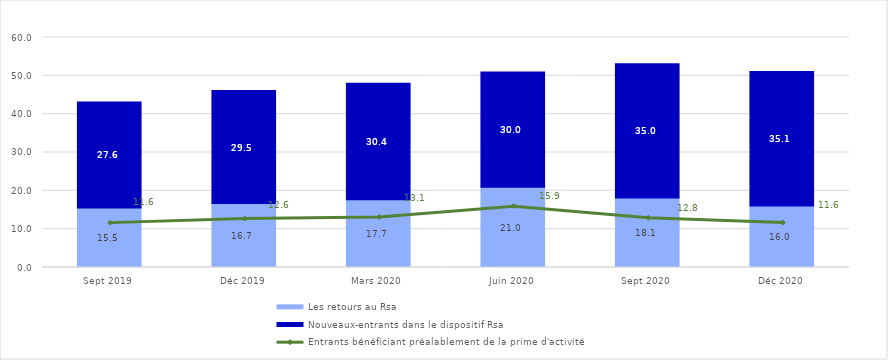
| Category | Les retours au Rsa | Nouveaux-entrants dans le dispositif Rsa  |
|---|---|---|
| Sept 2019 | 15.531 | 27.648 |
| Déc 2019 | 16.682 | 29.504 |
| Mars 2020 | 17.701 | 30.358 |
| Juin 2020 | 20.965 | 30.019 |
| Sept 2020 | 18.137 | 35.041 |
| Déc 2020 | 16.02 | 35.109 |